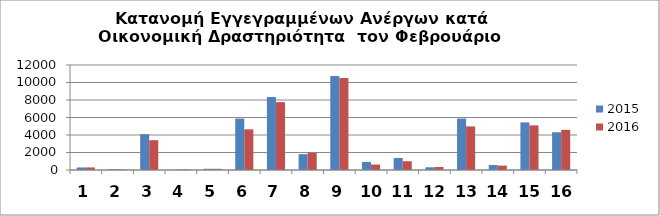
| Category | 2015 | 2016 |
|---|---|---|
| 0 | 290 | 293 |
| 1 | 86 | 59 |
| 2 | 4097 | 3407 |
| 3 | 34 | 54 |
| 4 | 141 | 138 |
| 5 | 5879 | 4648 |
| 6 | 8342 | 7756 |
| 7 | 1812 | 1949 |
| 8 | 10743 | 10517 |
| 9 | 919 | 622 |
| 10 | 1377 | 1004 |
| 11 | 310 | 344 |
| 12 | 5885 | 4982 |
| 13 | 572 | 498 |
| 14 | 5438 | 5104 |
| 15 | 4315 | 4586 |